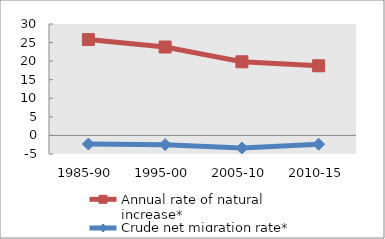
| Category | Annual rate of natural increase* | Crude net migration rate* |
|---|---|---|
| 1985-90 | 25.814 | -2.337 |
| 1995-00 | 23.803 | -2.48 |
| 2005-10 | 19.826 | -3.386 |
| 2010-15 | 18.751 | -2.361 |